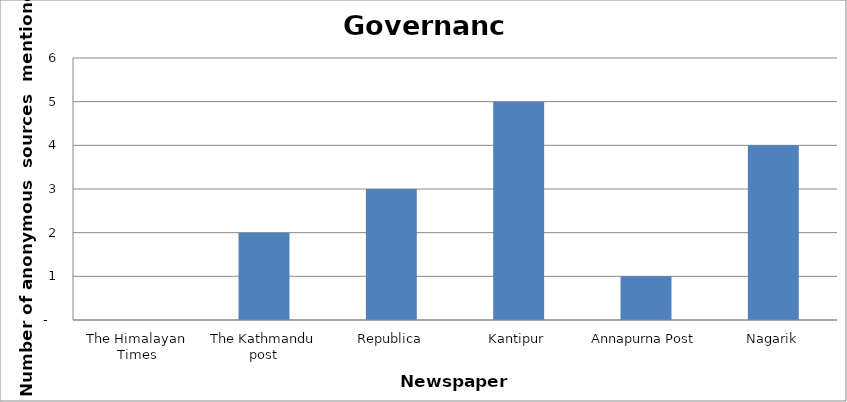
| Category | Governance |
|---|---|
| The Himalayan Times | 0 |
| The Kathmandu post | 2 |
| Republica | 3 |
| Kantipur | 5 |
| Annapurna Post | 1 |
| Nagarik | 4 |